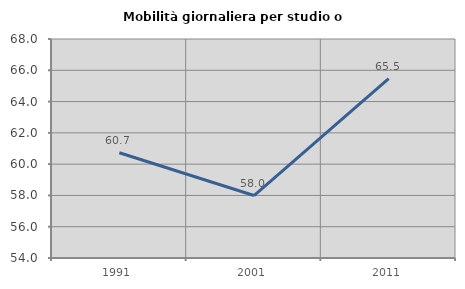
| Category | Mobilità giornaliera per studio o lavoro |
|---|---|
| 1991.0 | 60.725 |
| 2001.0 | 57.995 |
| 2011.0 | 65.464 |